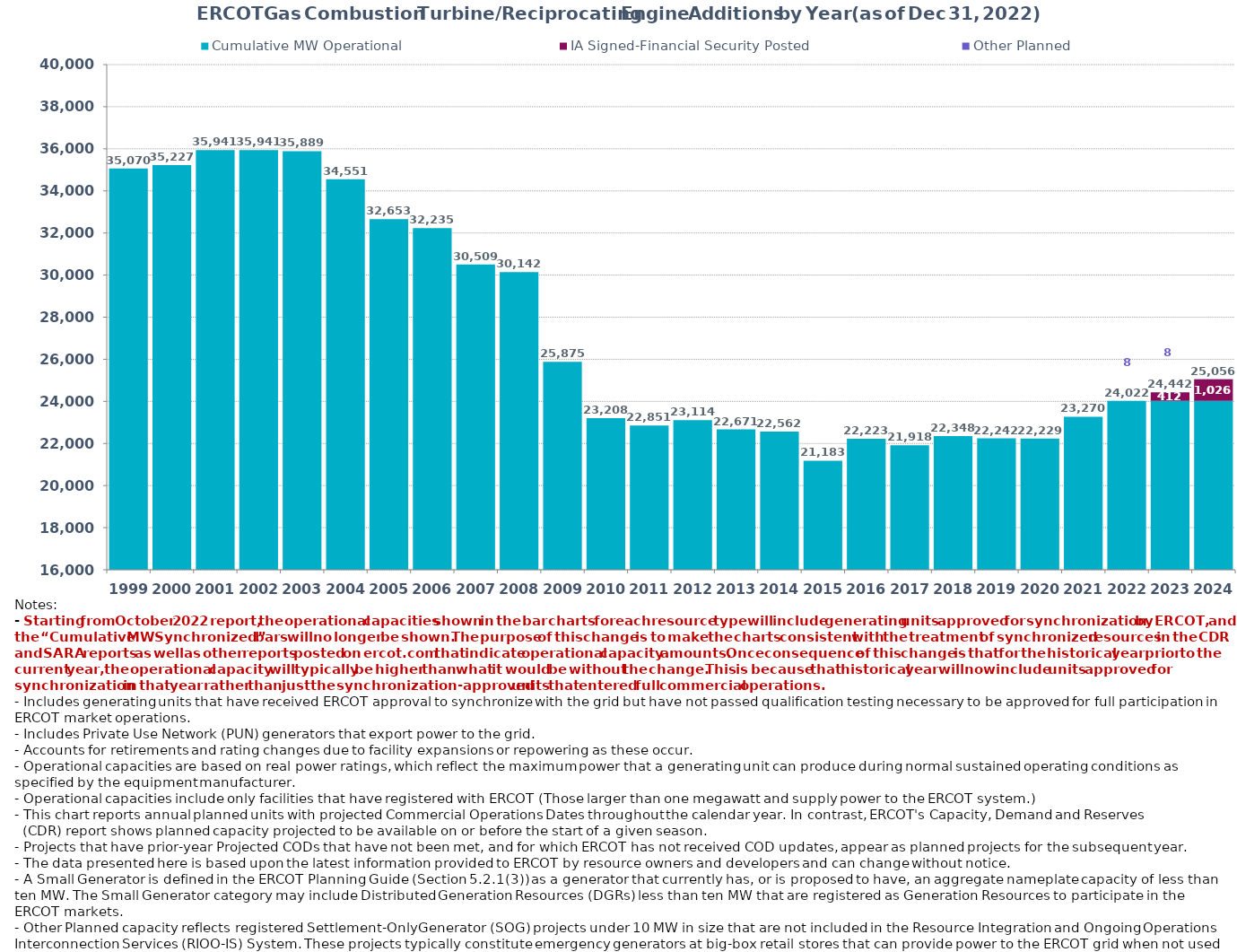
| Category | Cumulative MW Operational  | IA Signed-Financial Security Posted  | IA Signed-No Financial Security  | Other Planned | Cumulative Installed and Planned |
|---|---|---|---|---|---|
| 1999.0 | 35069.87 | 0 | 0 | 0 | 35069.87 |
| 2000.0 | 35227.48 | 0 | 0 | 0 | 35227.48 |
| 2001.0 | 35941.14 | 0 | 0 | 0 | 35941.14 |
| 2002.0 | 35941.14 | 0 | 0 | 0 | 35941.14 |
| 2003.0 | 35889.14 | 0 | 0 | 0 | 35889.14 |
| 2004.0 | 34551.24 | 0 | 0 | 0 | 34551.24 |
| 2005.0 | 32653.04 | 0 | 0 | 0 | 32653.04 |
| 2006.0 | 32235.14 | 0 | 0 | 0 | 32235.14 |
| 2007.0 | 30509.14 | 0 | 0 | 0 | 30509.14 |
| 2008.0 | 30141.94 | 0 | 0 | 0 | 30141.94 |
| 2009.0 | 25875.17 | 0 | 0 | 0 | 25875.17 |
| 2010.0 | 23208.05 | 0 | 0 | 0 | 23208.05 |
| 2011.0 | 22851.35 | 0 | 0 | 0 | 22851.35 |
| 2012.0 | 23113.55 | 0 | 0 | 0 | 23113.55 |
| 2013.0 | 22670.71 | 0 | 0 | 0 | 22670.71 |
| 2014.0 | 22561.71 | 0 | 0 | 0 | 22561.71 |
| 2015.0 | 21182.91 | 0 | 0 | 0 | 21182.91 |
| 2016.0 | 22223.29 | 0 | 0 | 0 | 22223.29 |
| 2017.0 | 21918.43 | 0 | 0 | 0 | 21918.43 |
| 2018.0 | 22347.59 | 0 | 0 | 0 | 22347.59 |
| 2019.0 | 22242.29 | 0 | 0 | 0 | 22242.29 |
| 2020.0 | 22229.29 | 0 | 0 | 0 | 22229.29 |
| 2021.0 | 23270.39 | 0 | 0 | 0 | 23270.39 |
| 2022.0 | 24022.19 | 0 | 0 | 0 | 24022.19 |
| 2023.0 | 24022.19 | 412 | 0 | 7.6 | 24441.79 |
| 2024.0 | 24022.19 | 1025.72 | 0 | 7.6 | 25055.51 |